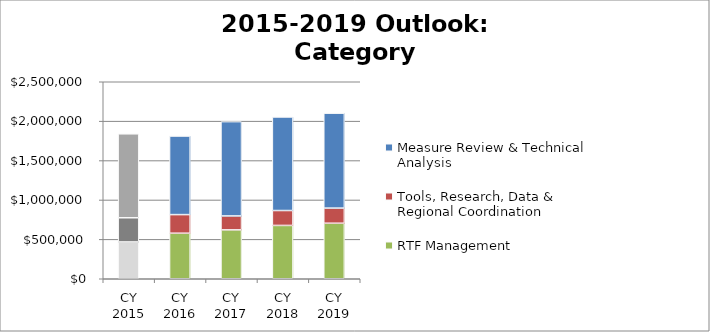
| Category | RTF Management | Tools, Research, Data & Regional Coordination | Measure Review & Technical Analysis |
|---|---|---|---|
| CY 2015 | 467100 | 307000 | 1065100 |
| CY 2016 | 578000 | 236000 | 997100 |
| CY 2017 | 620300 | 177000 | 1196700 |
| CY 2018 | 676700 | 189200 | 1187200 |
| CY 2019 | 704600 | 192100 | 1204900 |